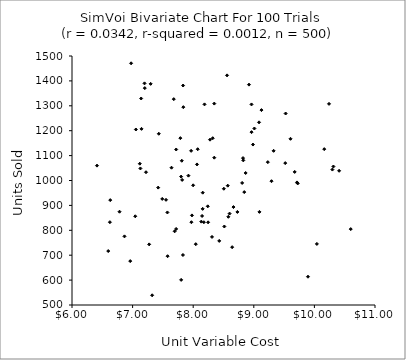
| Category | Series 0 |
|---|---|
| 8.5799233662857 | 854.23 |
| 8.322798937939595 | 1169.861 |
| 7.201467640726995 | 1371.011 |
| 7.811482448741565 | 1079.31 |
| 9.126457782483506 | 1282.814 |
| 6.412461766414863 | 1059.682 |
| 7.719423426696527 | 1124.521 |
| 8.558672436460132 | 1422.244 |
| 7.718661596310512 | 805.429 |
| 8.134011712817045 | 834.728 |
| 8.277950662160677 | 1163.925 |
| 8.842556173277387 | 953.472 |
| 7.817644752392725 | 1002.386 |
| 8.176340179564193 | 832.467 |
| 7.4217532251195735 | 971.409 |
| 6.960760332587584 | 676.319 |
| 7.8313111702073375 | 700.836 |
| 9.71253204860519 | 992.286 |
| 9.009559051875458 | 1208.853 |
| 8.429496647251241 | 757.344 |
| 7.8008792750240925 | 1015.661 |
| 8.07472128533649 | 1125.615 |
| 9.518861166413696 | 1069.892 |
| 7.970406837737856 | 832.478 |
| 7.273194652571533 | 743.458 |
| 7.489083048809267 | 926.007 |
| 6.625377284255234 | 832.652 |
| 7.128963195392983 | 1048.438 |
| 8.865515044995588 | 1030.204 |
| 9.52524895477391 | 1269.046 |
| 7.147236327511475 | 1207.338 |
| 9.605819153306468 | 1167.42 |
| 10.241340660086065 | 1307.757 |
| 10.162434953613667 | 1125.903 |
| 8.98643888838562 | 1144.347 |
| 10.407936328515019 | 1038.957 |
| 7.80082965003337 | 600.88 |
| 6.784236433408008 | 874.603 |
| 10.599768073922213 | 804.831 |
| 8.643014296777642 | 732.243 |
| 8.807678212906168 | 990.234 |
| 8.600419279409046 | 867.098 |
| 6.975359096767873 | 1470.634 |
| 9.086596772953316 | 1233.588 |
| 7.577680843721031 | 696.022 |
| 7.551469433422725 | 922.416 |
| 7.836890463266036 | 1294.505 |
| 9.326992812133225 | 1119.146 |
| 7.5745251901715385 | 871.681 |
| 7.322483061726135 | 538.991 |
| 8.822264579407284 | 1090.006 |
| 7.833156971276349 | 1381.438 |
| 9.674772377563313 | 1034.427 |
| 8.156055103904192 | 886.151 |
| 8.157255140924462 | 951.063 |
| 9.292115899744925 | 997.18 |
| 9.894085944671128 | 613.551 |
| 8.664326146974176 | 893.324 |
| 8.570173434086822 | 979.211 |
| 7.432071488580894 | 1187.695 |
| 10.04098471025165 | 745.333 |
| 7.221376723690576 | 1033.237 |
| 8.505475958668336 | 966.919 |
| 7.054271388777496 | 1204.847 |
| 8.347905742809601 | 1308.863 |
| 7.297879118243739 | 1388.137 |
| 8.245654359947244 | 831.999 |
| 8.310356491929902 | 773.353 |
| 7.965956030151336 | 1119.056 |
| 8.24025815329633 | 896.287 |
| 7.999096391088855 | 980.61 |
| 6.866053827382114 | 775.631 |
| 8.042941091310917 | 744.272 |
| 7.1412601472951 | 1329.331 |
| 9.724901645840218 | 988.214 |
| 10.296987174791745 | 1043.899 |
| 8.51369282584637 | 815.304 |
| 9.23186368257091 | 1073.694 |
| 7.9795982688006895 | 859.874 |
| 7.642314292760345 | 1051.392 |
| 8.962169920184742 | 1305.487 |
| 7.0438523837948 | 856.355 |
| 6.597758075026703 | 716.742 |
| 7.920935150421331 | 1019.464 |
| 7.679708956540013 | 1326.685 |
| 7.196719318290606 | 1390.113 |
| 6.63118055024673 | 921.232 |
| 8.348073995229859 | 1091.644 |
| 8.82716989691528 | 1080.904 |
| 7.69428427379326 | 795.877 |
| 8.920333096546887 | 1385.003 |
| 8.18654853860172 | 1305.711 |
| 8.14617908735314 | 857.593 |
| 9.092834100716615 | 873.941 |
| 8.963035757919336 | 1194.191 |
| 7.118918414560007 | 1067.496 |
| 7.787961204840504 | 1170.08 |
| 8.729084537025106 | 873.683 |
| 10.313668248811222 | 1056.209 |
| 8.062534990859206 | 1064.546 |